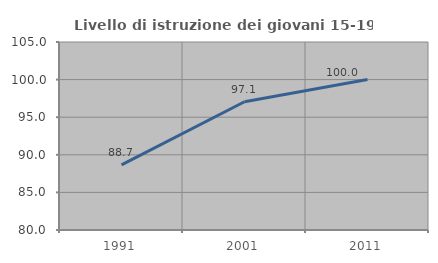
| Category | Livello di istruzione dei giovani 15-19 anni |
|---|---|
| 1991.0 | 88.66 |
| 2001.0 | 97.059 |
| 2011.0 | 100 |